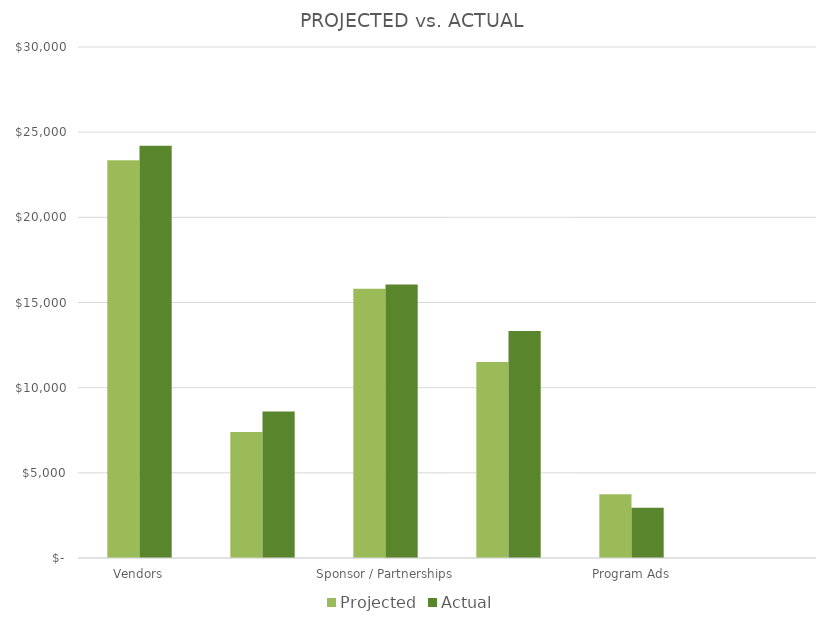
| Category | Projected | Actual |
|---|---|---|
| Vendors | 23350 | 24200 |
| Sponsor / Partnerships | 7400 | 8600 |
| Program Ads | 15800 | 16050 |
| Ticket Sales | 11500 | 13325 |
| Product Sales | 3750 | 2950 |
| Other | 0 | 0 |